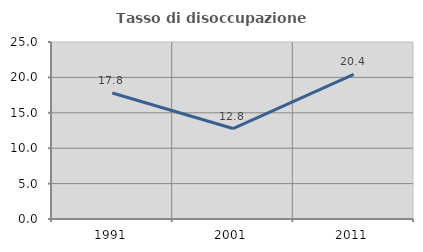
| Category | Tasso di disoccupazione giovanile  |
|---|---|
| 1991.0 | 17.804 |
| 2001.0 | 12.778 |
| 2011.0 | 20.438 |